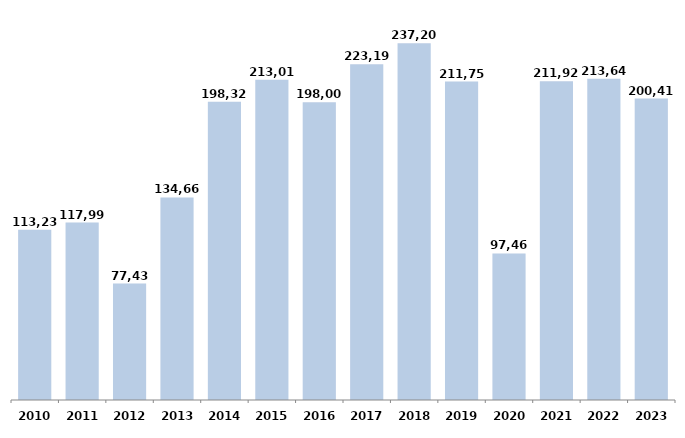
| Category | Series 0 |
|---|---|
| 2010 | 113237.28 |
| 2011 | 117989.9 |
| 2012 | 77431.15 |
| 2013 | 134660.28 |
| 2014 | 198320.28 |
| 2015 | 213014.5 |
| 2016 | 198003.93 |
| 2017 | 223191.89 |
| 2018 | 237206.96 |
| 2019 | 211751.705 |
| 2020 | 97462.2 |
| 2021 | 211923 |
| 2022 | 213643 |
| 2023 | 200410.581 |